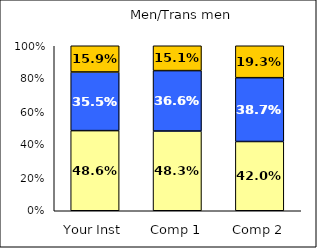
| Category | Low College Reputation Orientation | Average College Reputation Orientation | High College Reputation Orientation |
|---|---|---|---|
| Your Inst | 0.486 | 0.355 | 0.159 |
| Comp 1 | 0.483 | 0.366 | 0.151 |
| Comp 2 | 0.42 | 0.387 | 0.193 |